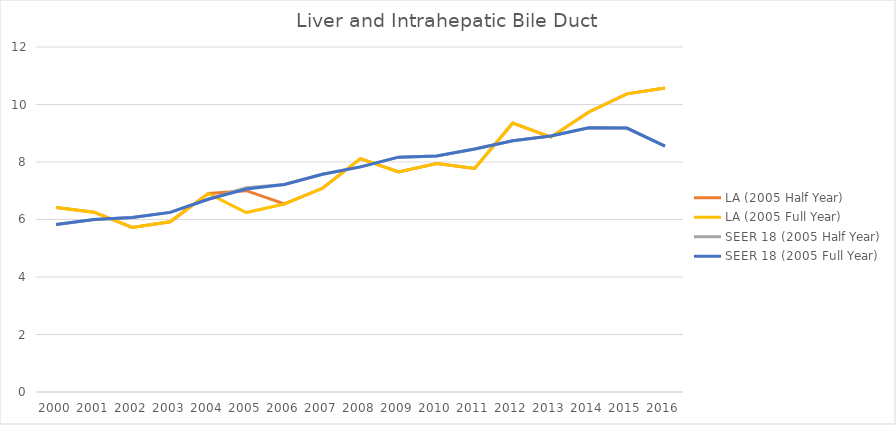
| Category | LA (2005 Half Year) | LA (2005 Full Year) | SEER 18 (2005 Half Year) | SEER 18 (2005 Full Year) |
|---|---|---|---|---|
| 2000.0 | 6.418 | 6.418 | 5.829 | 5.829 |
| 2001.0 | 6.253 | 6.253 | 5.998 | 5.998 |
| 2002.0 | 5.726 | 5.726 | 6.071 | 6.071 |
| 2003.0 | 5.921 | 5.921 | 6.248 | 6.248 |
| 2004.0 | 6.906 | 6.906 | 6.703 | 6.703 |
| 2005.0 | 7.002 | 6.242 | 7.109 | 7.063 |
| 2006.0 | 6.539 | 6.539 | 7.217 | 7.217 |
| 2007.0 | 7.085 | 7.085 | 7.571 | 7.571 |
| 2008.0 | 8.118 | 8.118 | 7.83 | 7.83 |
| 2009.0 | 7.656 | 7.656 | 8.169 | 8.169 |
| 2010.0 | 7.944 | 7.944 | 8.209 | 8.209 |
| 2011.0 | 7.778 | 7.778 | 8.45 | 8.45 |
| 2012.0 | 9.357 | 9.357 | 8.741 | 8.741 |
| 2013.0 | 8.863 | 8.863 | 8.903 | 8.903 |
| 2014.0 | 9.741 | 9.741 | 9.192 | 9.192 |
| 2015.0 | 10.371 | 10.371 | 9.179 | 9.179 |
| 2016.0 | 10.577 | 10.577 | 8.554 | 8.554 |